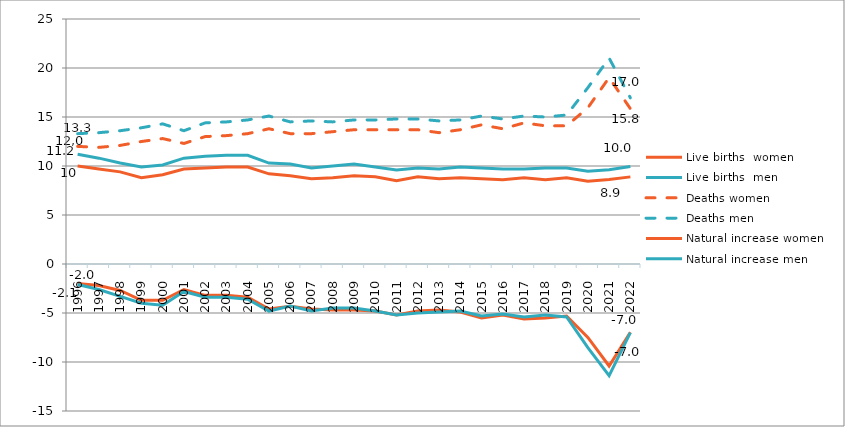
| Category | Live births  | Deaths | Natural increase |
|---|---|---|---|
| 1996.0 | 11.2 | 13.3 | -2.1 |
| 1997.0 | 10.8 | 13.4 | -2.6 |
| 1998.0 | 10.3 | 13.6 | -3.3 |
| 1999.0 | 9.9 | 13.9 | -4 |
| 2000.0 | 10.1 | 14.3 | -4.2 |
| 2001.0 | 10.8 | 13.6 | -2.8 |
| 2002.0 | 11 | 14.4 | -3.4 |
| 2003.0 | 11.1 | 14.5 | -3.4 |
| 2004.0 | 11.1 | 14.7 | -3.6 |
| 2005.0 | 10.3 | 15.1 | -4.8 |
| 2006.0 | 10.2 | 14.5 | -4.3 |
| 2007.0 | 9.8 | 14.6 | -4.8 |
| 2008.0 | 10 | 14.5 | -4.5 |
| 2009.0 | 10.2 | 14.7 | -4.5 |
| 2010.0 | 9.9 | 14.7 | -4.8 |
| 2011.0 | 9.6 | 14.8 | -5.2 |
| 2012.0 | 9.8 | 14.8 | -5 |
| 2013.0 | 9.7 | 14.6 | -4.9 |
| 2014.0 | 9.9 | 14.7 | -4.8 |
| 2015.0 | 9.8 | 15.1 | -5.3 |
| 2016.0 | 9.7 | 14.8 | -5.1 |
| 2017.0 | 9.7 | 15.1 | -5.4 |
| 2018.0 | 9.8 | 15 | -5.2 |
| 2019.0 | 9.8 | 15.2 | -5.4 |
| 2020.0 | 9.458 | 17.989 | -8.531 |
| 2021.0 | 9.61 | 21.012 | -11.403 |
| 2022.0 | 9.956 | 16.955 | -6.999 |